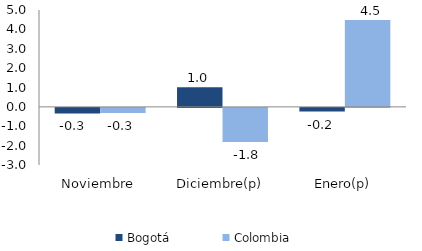
| Category | Bogotá | Colombia |
|---|---|---|
| Noviembre | -0.286 | -0.268 |
| Diciembre(p) | 1.012 | -1.764 |
| Enero(p) | -0.193 | 4.483 |